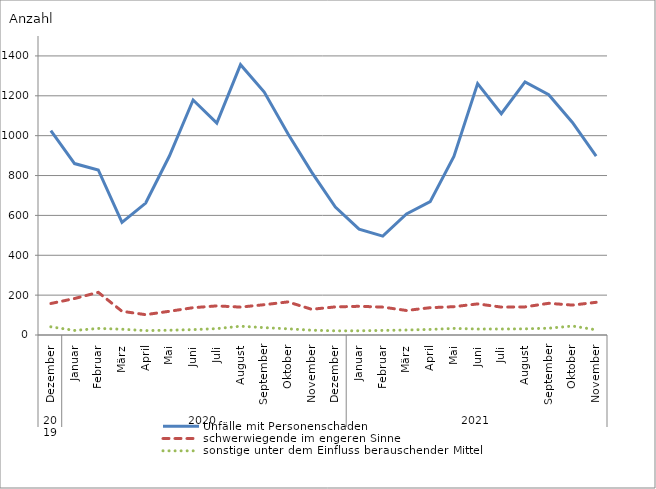
| Category | Unfälle mit Personenschaden | schwerwiegende im engeren Sinne | sonstige unter dem Einfluss berauschender Mittel |
|---|---|---|---|
| 0 | 1025 | 158 | 41 |
| 1 | 860 | 183 | 23 |
| 2 | 828 | 214 | 33 |
| 3 | 565 | 119 | 29 |
| 4 | 662 | 102 | 22 |
| 5 | 898 | 119 | 24 |
| 6 | 1179 | 137 | 27 |
| 7 | 1063 | 146 | 32 |
| 8 | 1356 | 140 | 44 |
| 9 | 1219 | 152 | 37 |
| 10 | 1010 | 166 | 31 |
| 11 | 817 | 129 | 24 |
| 12 | 642 | 141 | 21 |
| 13 | 531 | 144 | 21 |
| 14 | 496 | 140 | 23 |
| 15 | 607 | 123 | 25 |
| 16 | 669 | 137 | 28 |
| 17 | 896 | 142 | 33 |
| 18 | 1261 | 156 | 30 |
| 19 | 1110 | 140 | 30 |
| 20 | 1270 | 141 | 31 |
| 21 | 1205 | 159 | 34 |
| 22 | 1066 | 150 | 45 |
| 23 | 897 | 164 | 26 |